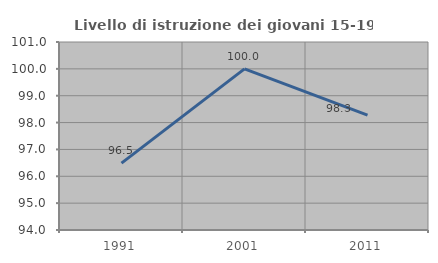
| Category | Livello di istruzione dei giovani 15-19 anni |
|---|---|
| 1991.0 | 96.491 |
| 2001.0 | 100 |
| 2011.0 | 98.276 |